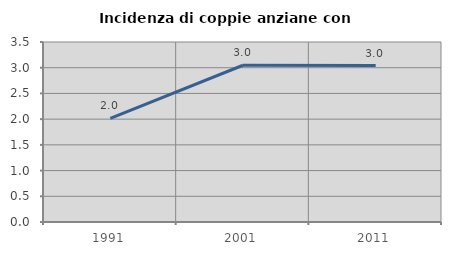
| Category | Incidenza di coppie anziane con figli |
|---|---|
| 1991.0 | 2.013 |
| 2001.0 | 3.048 |
| 2011.0 | 3.042 |